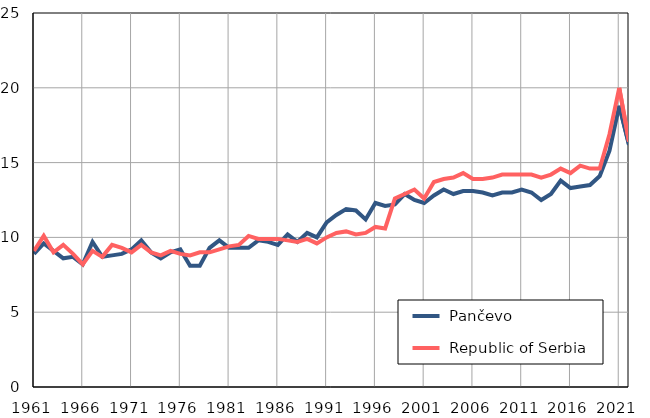
| Category |  Pančevo |  Republic of Serbia |
|---|---|---|
| 1961.0 | 8.9 | 9.1 |
| 1962.0 | 9.6 | 10.1 |
| 1963.0 | 9.1 | 9 |
| 1964.0 | 8.6 | 9.5 |
| 1965.0 | 8.7 | 8.9 |
| 1966.0 | 8.2 | 8.2 |
| 1967.0 | 9.7 | 9.1 |
| 1968.0 | 8.7 | 8.7 |
| 1969.0 | 8.8 | 9.5 |
| 1970.0 | 8.9 | 9.3 |
| 1971.0 | 9.2 | 9 |
| 1972.0 | 9.8 | 9.5 |
| 1973.0 | 9 | 9 |
| 1974.0 | 8.6 | 8.8 |
| 1975.0 | 9 | 9.1 |
| 1976.0 | 9.2 | 8.9 |
| 1977.0 | 8.1 | 8.8 |
| 1978.0 | 8.1 | 9 |
| 1979.0 | 9.3 | 9 |
| 1980.0 | 9.8 | 9.2 |
| 1981.0 | 9.3 | 9.4 |
| 1982.0 | 9.3 | 9.5 |
| 1983.0 | 9.3 | 10.1 |
| 1984.0 | 9.8 | 9.9 |
| 1985.0 | 9.7 | 9.9 |
| 1986.0 | 9.5 | 9.9 |
| 1987.0 | 10.2 | 9.8 |
| 1988.0 | 9.7 | 9.7 |
| 1989.0 | 10.3 | 9.9 |
| 1990.0 | 10 | 9.6 |
| 1991.0 | 11 | 10 |
| 1992.0 | 11.5 | 10.3 |
| 1993.0 | 11.9 | 10.4 |
| 1994.0 | 11.8 | 10.2 |
| 1995.0 | 11.2 | 10.3 |
| 1996.0 | 12.3 | 10.7 |
| 1997.0 | 12.1 | 10.6 |
| 1998.0 | 12.2 | 12.6 |
| 1999.0 | 12.9 | 12.9 |
| 2000.0 | 12.5 | 13.2 |
| 2001.0 | 12.3 | 12.6 |
| 2002.0 | 12.8 | 13.7 |
| 2003.0 | 13.2 | 13.9 |
| 2004.0 | 12.9 | 14 |
| 2005.0 | 13.1 | 14.3 |
| 2006.0 | 13.1 | 13.9 |
| 2007.0 | 13 | 13.9 |
| 2008.0 | 12.8 | 14 |
| 2009.0 | 13 | 14.2 |
| 2010.0 | 13 | 14.2 |
| 2011.0 | 13.2 | 14.2 |
| 2012.0 | 13 | 14.2 |
| 2013.0 | 12.5 | 14 |
| 2014.0 | 12.9 | 14.2 |
| 2015.0 | 13.8 | 14.6 |
| 2016.0 | 13.3 | 14.3 |
| 2017.0 | 13.4 | 14.8 |
| 2018.0 | 13.5 | 14.6 |
| 2019.0 | 14.1 | 14.6 |
| 2020.0 | 15.8 | 16.9 |
| 2021.0 | 18.8 | 20 |
| 2022.0 | 16.2 | 16.4 |